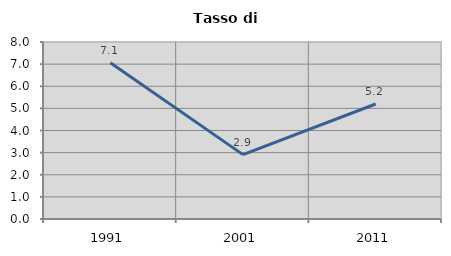
| Category | Tasso di disoccupazione   |
|---|---|
| 1991.0 | 7.065 |
| 2001.0 | 2.91 |
| 2011.0 | 5.198 |